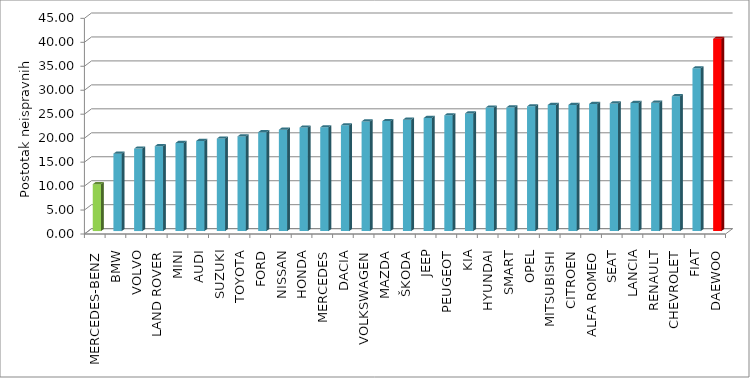
| Category | Series 4 |
|---|---|
| MERCEDES-BENZ | 9.786 |
| BMW | 16.144 |
| VOLVO | 17.209 |
| LAND ROVER | 17.721 |
| MINI | 18.377 |
| AUDI | 18.798 |
| SUZUKI | 19.297 |
| TOYOTA | 19.754 |
| FORD | 20.639 |
| NISSAN | 21.144 |
| HONDA | 21.602 |
| MERCEDES | 21.648 |
| DACIA | 22.071 |
| VOLKSWAGEN | 22.876 |
| MAZDA | 22.948 |
| ŠKODA | 23.248 |
| JEEP | 23.593 |
| PEUGEOT | 24.155 |
| KIA | 24.551 |
| HYUNDAI | 25.769 |
| SMART | 25.801 |
| OPEL | 26.021 |
| MITSUBISHI | 26.311 |
| CITROEN | 26.32 |
| ALFA ROMEO | 26.532 |
| SEAT | 26.638 |
| LANCIA | 26.74 |
| RENAULT | 26.786 |
| CHEVROLET | 28.132 |
| FIAT | 33.965 |
| DAEWOO | 40.112 |